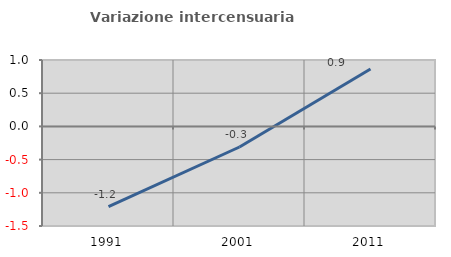
| Category | Variazione intercensuaria annua |
|---|---|
| 1991.0 | -1.21 |
| 2001.0 | -0.31 |
| 2011.0 | 0.864 |